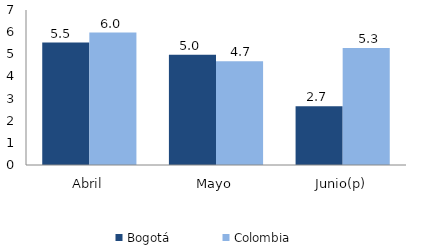
| Category | Bogotá | Colombia |
|---|---|---|
| Abril | 5.53 | 5.981 |
| Mayo | 4.974 | 4.685 |
| Junio(p) | 2.655 | 5.28 |